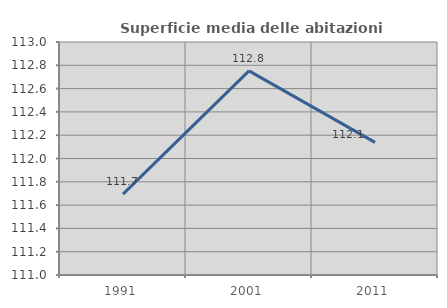
| Category | Superficie media delle abitazioni occupate |
|---|---|
| 1991.0 | 111.694 |
| 2001.0 | 112.752 |
| 2011.0 | 112.139 |